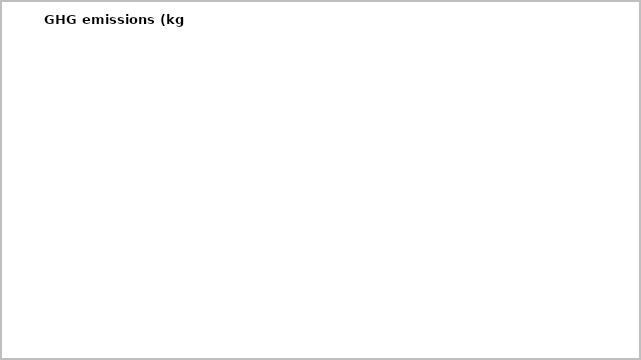
| Category | GHG emissions (kg CO2e) |
|---|---|
| Electricity, Office | 0 |
| Electricity, server room | 0 |
| Electricity, XX building | 0 |
| Electricity, kitchen | 0 |
| Electricity, library | 0 |
| Electricity, outside | 0 |
| Natural gas | 0 |